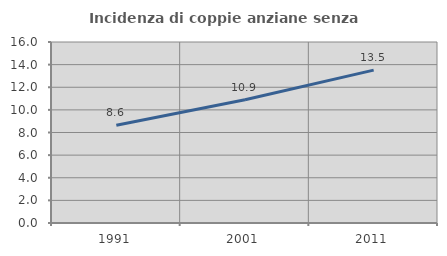
| Category | Incidenza di coppie anziane senza figli  |
|---|---|
| 1991.0 | 8.638 |
| 2001.0 | 10.897 |
| 2011.0 | 13.514 |